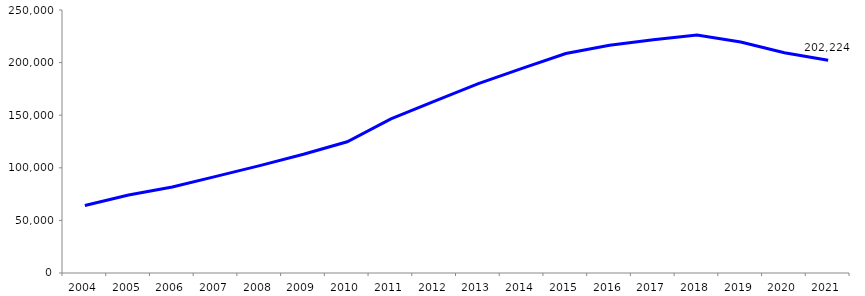
| Category | 64,192 |
|---|---|
| 2004 | 64192 |
| 2005 | 74108 |
| 2006 | 81684 |
| 2007 | 91844 |
| 2008 | 102071 |
| 2009 | 112843 |
| 2010 | 124783 |
| 2011 | 146465 |
| 2012 | 163377 |
| 2013 | 180010 |
| 2014 | 194532 |
| 2015 | 208665 |
| 2016 | 216505 |
| 2017 | 221679 |
| 2018 | 226146 |
| 2019 | 219497 |
| 2020 | 209355 |
| 2021 | 202224 |